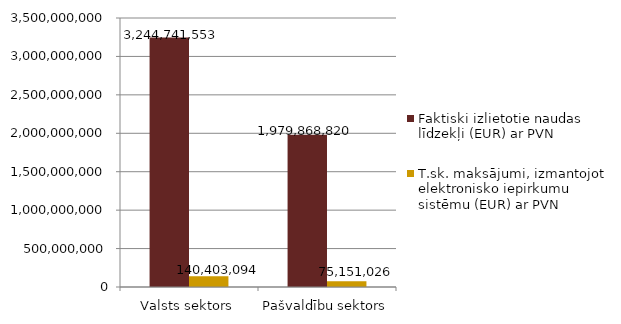
| Category | Faktiski izlietotie naudas līdzekļi (EUR) ar PVN | T.sk. maksājumi, izmantojot elektronisko iepirkumu sistēmu (EUR) ar PVN |
|---|---|---|
| Valsts sektors | 3244741553 | 140403094 |
| Pašvaldību sektors | 1979868820 | 75151026 |